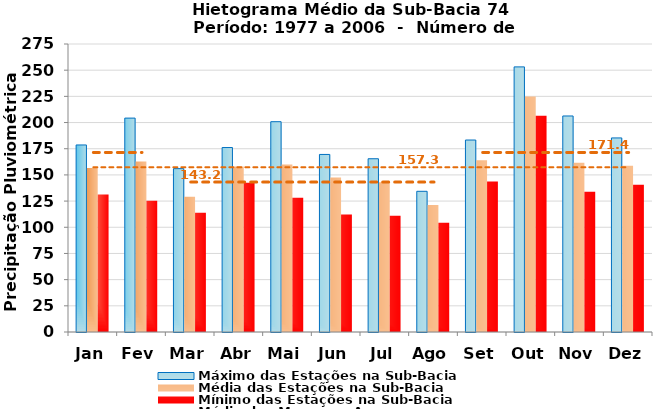
| Category | Máximo das Estações na Sub-Bacia | Média das Estações na Sub-Bacia | Mínimo das Estações na Sub-Bacia |
|---|---|---|---|
| Jan | 178.59 | 156.522 | 131.36 |
| Fev | 204.248 | 162.777 | 125.41 |
| Mar | 156 | 129.218 | 113.96 |
| Abr | 176.133 | 158.042 | 142.537 |
| Mai | 200.811 | 160.013 | 128.307 |
| Jun | 169.543 | 147.602 | 112.155 |
| Jul | 165.433 | 142.974 | 111.01 |
| Ago | 134.347 | 121.269 | 104.433 |
| Set | 183.31 | 164.016 | 143.657 |
| Out | 253.147 | 224.952 | 206.377 |
| Nov | 206.272 | 161.545 | 133.877 |
| Dez | 185.307 | 158.714 | 140.707 |